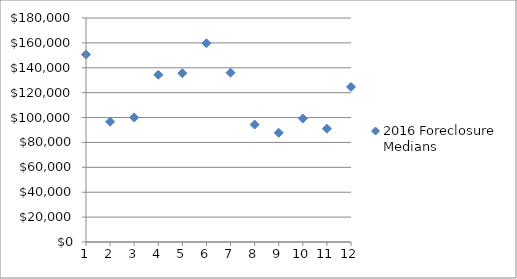
| Category | 2016 Foreclosure Medians |
|---|---|
| 1.0 | 150678 |
| 2.0 | 96638 |
| 3.0 | 100064 |
| 4.0 | 134379 |
| 5.0 | 135620.5 |
| 6.0 | 159695.5 |
| 7.0 | 136050.5 |
| 8.0 | 94356 |
| 9.0 | 87740 |
| 10.0 | 99261 |
| 11.0 | 91058 |
| 12.0 | 124611 |